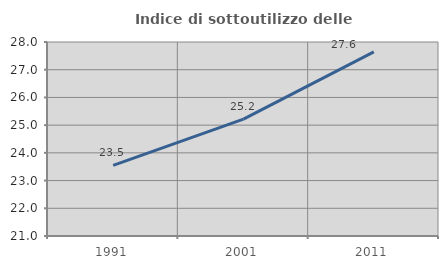
| Category | Indice di sottoutilizzo delle abitazioni  |
|---|---|
| 1991.0 | 23.549 |
| 2001.0 | 25.218 |
| 2011.0 | 27.643 |